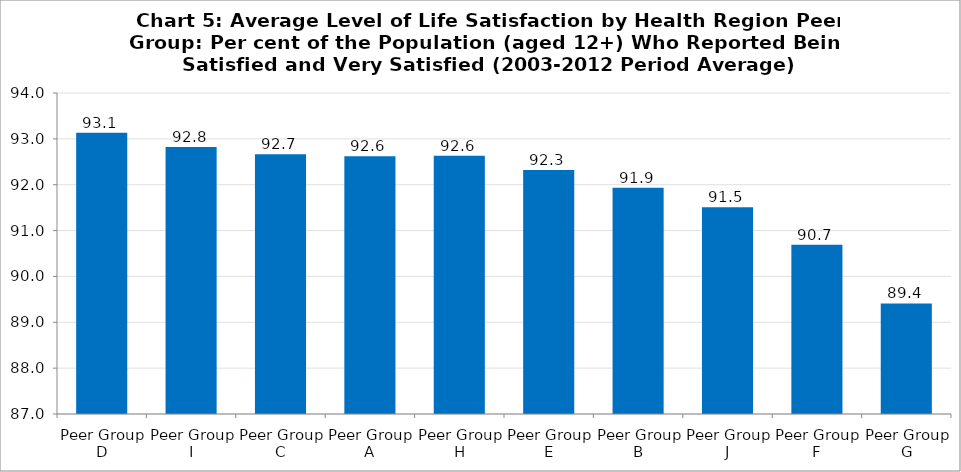
| Category | Series 0 | Series 1 | Series 2 | Series 3 | Series 4 | Series 5 | Series 6 | Series 7 | Series 8 | Series 9 |
|---|---|---|---|---|---|---|---|---|---|---|
| Peer Group D |  |  |  |  |  |  |  |  |  | 93.133 |
| Peer Group I |  |  |  |  |  |  |  |  |  | 92.822 |
| Peer Group C |  |  |  |  |  |  |  |  |  | 92.667 |
| Peer Group A |  |  |  |  |  |  |  |  |  | 92.622 |
| Peer Group H |  |  |  |  |  |  |  |  |  | 92.633 |
| Peer Group E |  |  |  |  |  |  |  |  |  | 92.322 |
| Peer Group B |  |  |  |  |  |  |  |  |  | 91.933 |
| Peer Group J |  |  |  |  |  |  |  |  |  | 91.511 |
| Peer Group F |  |  |  |  |  |  |  |  |  | 90.689 |
| Peer Group G |  |  |  |  |  |  |  |  |  | 89.411 |